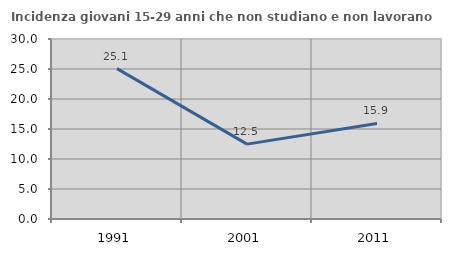
| Category | Incidenza giovani 15-29 anni che non studiano e non lavorano  |
|---|---|
| 1991.0 | 25.061 |
| 2001.0 | 12.482 |
| 2011.0 | 15.922 |